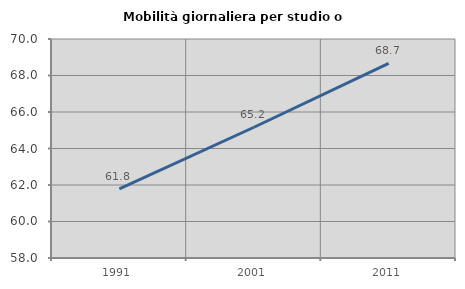
| Category | Mobilità giornaliera per studio o lavoro |
|---|---|
| 1991.0 | 61.793 |
| 2001.0 | 65.164 |
| 2011.0 | 68.664 |